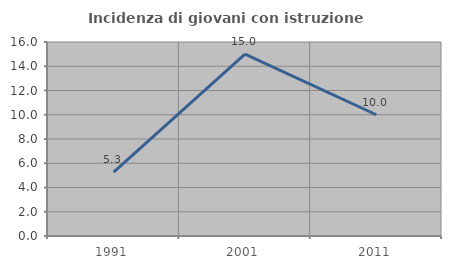
| Category | Incidenza di giovani con istruzione universitaria |
|---|---|
| 1991.0 | 5.263 |
| 2001.0 | 15 |
| 2011.0 | 10 |